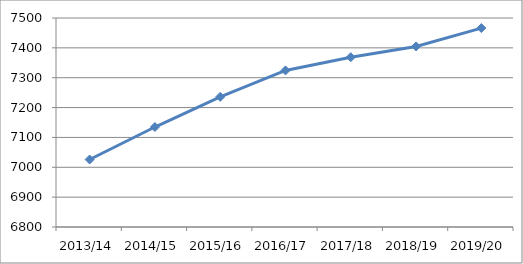
| Category | Series 0 |
|---|---|
| 2013/14 | 7026.07 |
| 2014/15 | 7134.86 |
| 2015/16 | 7236.01 |
| 2016/17 | 7324.34 |
| 2017/18 | 7368.7 |
| 2018/19 | 7404.8 |
| 2019/20 | 7466.25 |